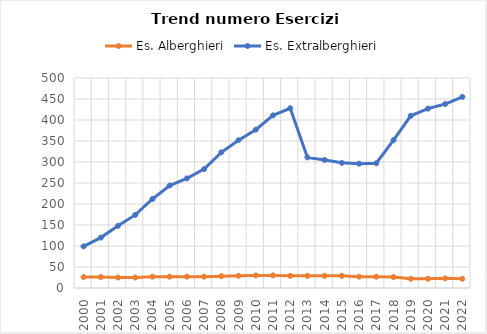
| Category | Es. Alberghieri | Es. Extralberghieri |
|---|---|---|
| 2000.0 | 26 | 99 |
| 2001.0 | 26 | 120 |
| 2002.0 | 25 | 148 |
| 2003.0 | 25 | 174 |
| 2004.0 | 27 | 212 |
| 2005.0 | 27 | 244 |
| 2006.0 | 27 | 261 |
| 2007.0 | 27 | 283 |
| 2008.0 | 28 | 323 |
| 2009.0 | 29 | 352 |
| 2010.0 | 30 | 377 |
| 2011.0 | 30 | 411 |
| 2012.0 | 29 | 428 |
| 2013.0 | 29 | 311 |
| 2014.0 | 29 | 305 |
| 2015.0 | 29 | 298 |
| 2016.0 | 27 | 296 |
| 2017.0 | 27 | 297 |
| 2018.0 | 26 | 352 |
| 2019.0 | 22 | 410 |
| 2020.0 | 22 | 427 |
| 2021.0 | 23 | 438 |
| 2022.0 | 22 | 455 |